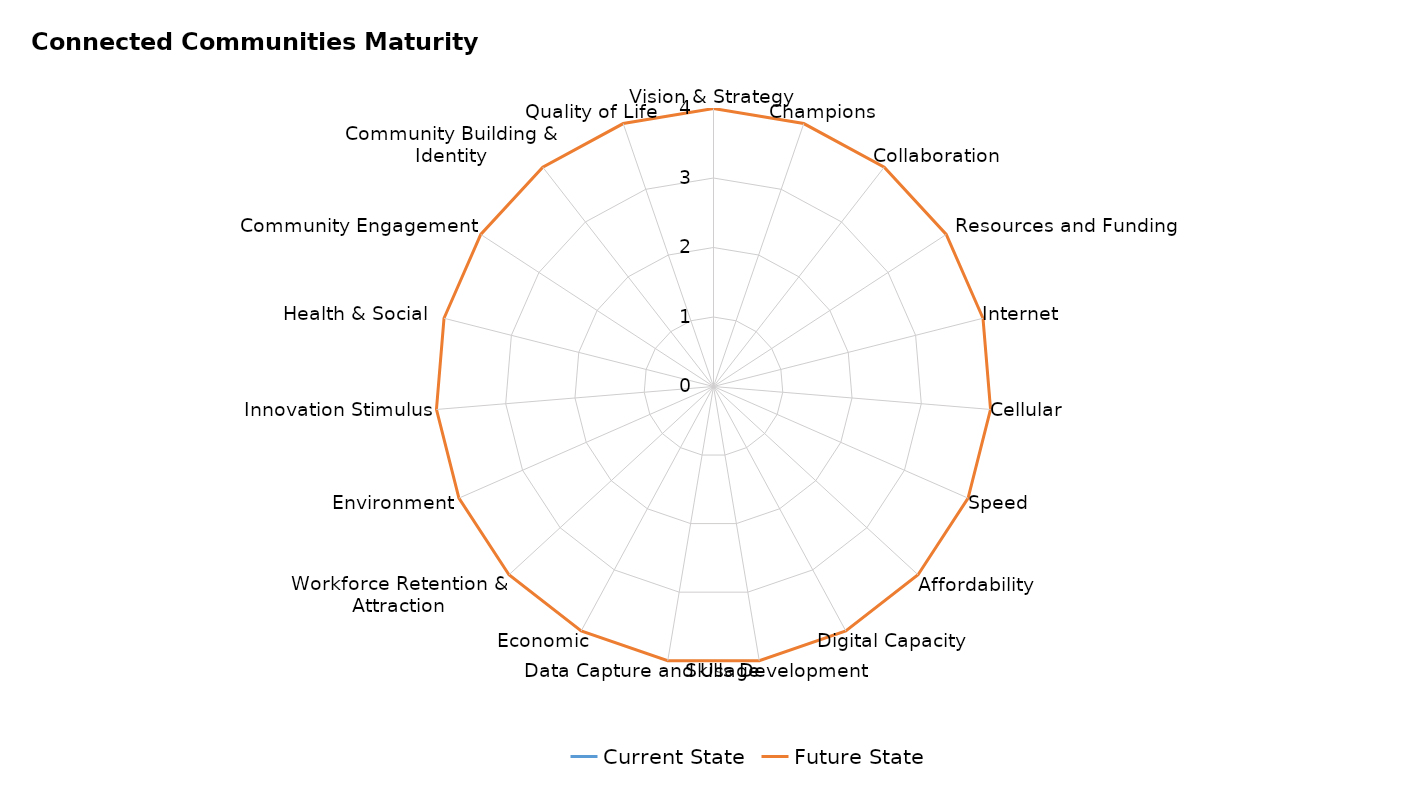
| Category | Current State | Future State  |
|---|---|---|
| Vision & Strategy | 0 | 4 |
| Champions  | 0 | 4 |
| Collaboration | 0 | 4 |
| Resources and Funding
 | 0 | 4 |
| Internet | 0 | 4 |
| Cellular | 0 | 4 |
| Speed | 0 | 4 |
| Affordability                           | 0 | 4 |
| Digital Capacity | 0 | 4 |
| Skills Development | 0 | 4 |
| Data Capture and Usage | 0 | 4 |
| Economic  | 0 | 4 |
| Workforce Retention & Attraction | 0 | 4 |
| Environment | 0 | 4 |
| Innovation Stimulus | 0 | 4 |
| Health & Social   | 0 | 4 |
| Community Engagement | 0 | 4 |
| Community Building & Identity | 0 | 4 |
| Quality of Life | 0 | 4 |